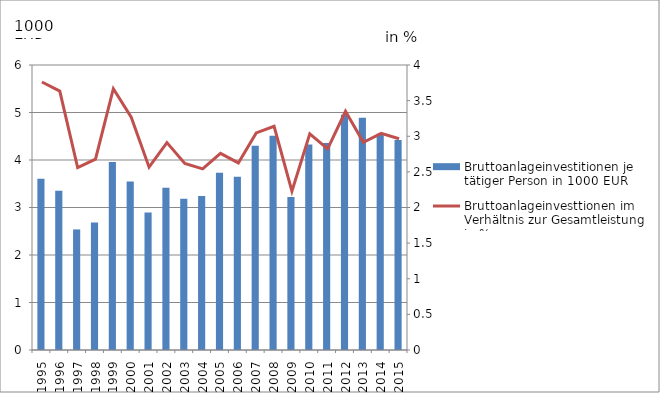
| Category | Bruttoanlageinvestitionen je tätiger Person in 1000 EUR |
|---|---|
| 1995.0 | 3.607 |
| 1996.0 | 3.355 |
| 1997.0 | 2.538 |
| 1998.0 | 2.683 |
| 1999.0 | 3.96 |
| 2000.0 | 3.549 |
| 2001.0 | 2.897 |
| 2002.0 | 3.414 |
| 2003.0 | 3.186 |
| 2004.0 | 3.244 |
| 2005.0 | 3.734 |
| 2006.0 | 3.649 |
| 2007.0 | 4.3 |
| 2008.0 | 4.51 |
| 2009.0 | 3.22 |
| 2010.0 | 4.327 |
| 2011.0 | 4.357 |
| 2012.0 | 4.955 |
| 2013.0 | 4.887 |
| 2014.0 | 4.555 |
| 2015.0 | 4.422 |